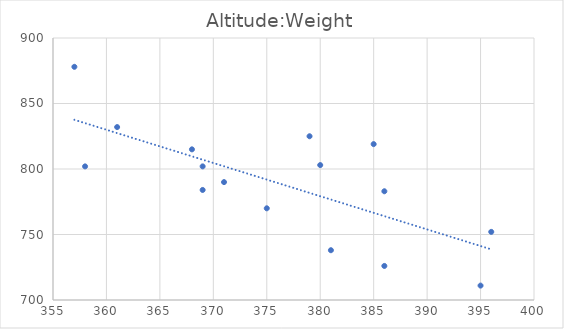
| Category | Altitude:Weight |
|---|---|
| 357.0 | 878 |
| 380.0 | 803 |
| 381.0 | 738 |
| 385.0 | 819 |
| 395.0 | 711 |
| 386.0 | 726 |
| 358.0 | 802 |
| 361.0 | 832 |
| 396.0 | 752 |
| 379.0 | 825 |
| 386.0 | 783 |
| 375.0 | 770 |
| 371.0 | 790 |
| 369.0 | 802 |
| 369.0 | 784 |
| 368.0 | 815 |